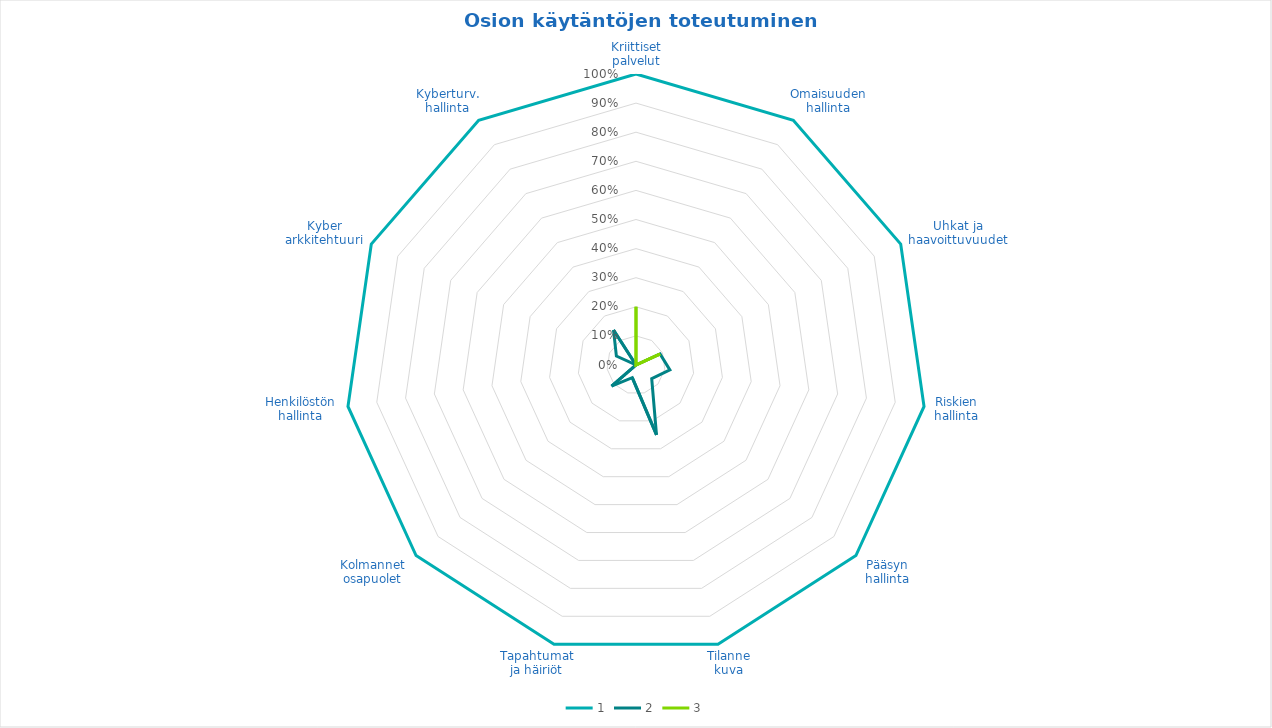
| Category | 1 | 2 | 3 |
|---|---|---|---|
| 0 | 1 | 0 | 0.2 |
| 1 | 1 | 0 | 0 |
| 2 | 1 | 0.091 | 0.091 |
| 3 | 1 | 0.118 | 0 |
| 4 | 1 | 0.071 | 0 |
| 5 | 1 | 0.25 | 0 |
| 6 | 1 | 0.045 | 0 |
| 7 | 1 | 0.111 | 0 |
| 8 | 1 | 0 | 0 |
| 9 | 1 | 0.074 | 0 |
| 10 | 1 | 0.143 | 0 |